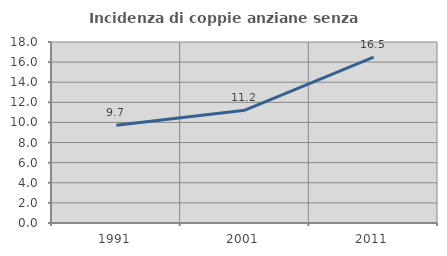
| Category | Incidenza di coppie anziane senza figli  |
|---|---|
| 1991.0 | 9.729 |
| 2001.0 | 11.223 |
| 2011.0 | 16.495 |